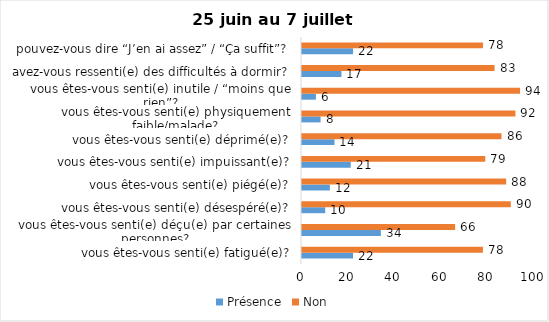
| Category | Présence | Non |
|---|---|---|
| vous êtes-vous senti(e) fatigué(e)? | 22 | 78 |
| vous êtes-vous senti(e) déçu(e) par certaines personnes? | 34 | 66 |
| vous êtes-vous senti(e) désespéré(e)? | 10 | 90 |
| vous êtes-vous senti(e) piégé(e)? | 12 | 88 |
| vous êtes-vous senti(e) impuissant(e)? | 21 | 79 |
| vous êtes-vous senti(e) déprimé(e)? | 14 | 86 |
| vous êtes-vous senti(e) physiquement faible/malade? | 8 | 92 |
| vous êtes-vous senti(e) inutile / “moins que rien”? | 6 | 94 |
| avez-vous ressenti(e) des difficultés à dormir? | 17 | 83 |
| pouvez-vous dire “J’en ai assez” / “Ça suffit”? | 22 | 78 |